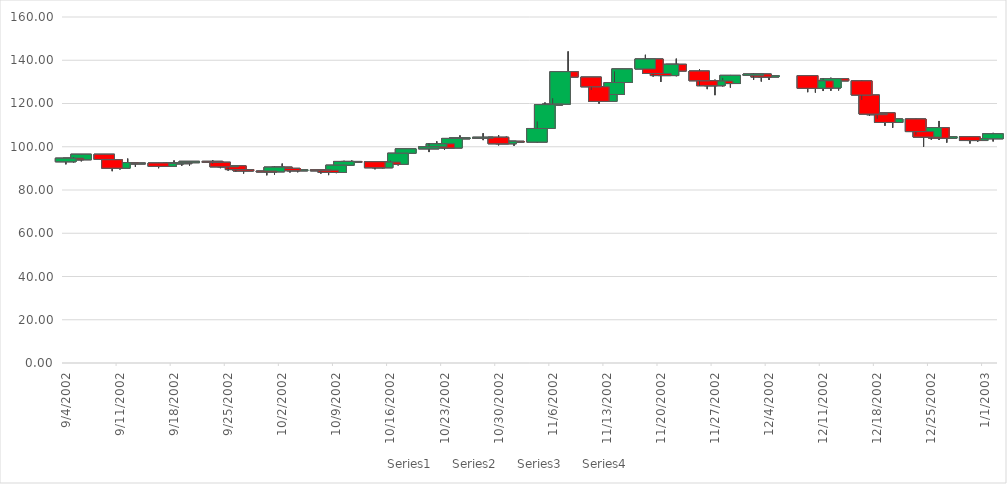
| Category | Series 0 | Series 1 | Series 2 | Series 3 |
|---|---|---|---|---|
| 1/2/03 | 103.7 | 106.42 | 102.47 | 105.99 |
| 12/31/02 | 102.88 | 103.97 | 102.29 | 103.7 |
| 12/30/02 | 104.64 | 104.79 | 101.5 | 102.88 |
| 12/27/02 | 103.97 | 104.94 | 101.92 | 104.64 |
| 12/26/02 | 108.84 | 111.92 | 103.13 | 103.97 |
| 12/25/02 | 104.47 | 109.06 | 103.27 | 108.84 |
| 12/24/02 | 107.02 | 107.31 | 100.02 | 104.47 |
| 12/23/02 | 112.86 | 112.95 | 105.53 | 107.02 |
| 12/20/02 | 111.25 | 113.51 | 108.79 | 112.86 |
| 12/19/02 | 115.69 | 115.69 | 109.71 | 111.25 |
| 12/18/02 | 115.11 | 117.25 | 112.93 | 115.28 |
| 12/17/02 | 123.92 | 123.92 | 114.31 | 115.11 |
| 12/16/02 | 130.47 | 130.86 | 121.64 | 123.92 |
| 12/13/02 | 131.47 | 131.47 | 126.05 | 130.47 |
| 12/12/02 | 127.17 | 131.92 | 125.89 | 131.47 |
| 12/11/02 | 130.48 | 131.57 | 125.77 | 127.17 |
| 12/10/02 | 127.04 | 130.48 | 125.07 | 130.48 |
| 12/9/02 | 132.87 | 132.87 | 125.24 | 127.04 |
| 12/4/02 | 132.26 | 132.87 | 130.86 | 132.87 |
| 12/3/02 | 133.64 | 133.64 | 130.19 | 132.26 |
| 12/2/02 | 133 | 134.08 | 130.97 | 133.64 |
| 11/29/02 | 129.24 | 133.19 | 127.38 | 133 |
| 11/28/02 | 130.37 | 131.86 | 127.93 | 129.24 |
| 11/27/02 | 128.24 | 131.02 | 123.86 | 130.37 |
| 11/26/02 | 130.53 | 131.89 | 126.65 | 128.24 |
| 11/25/02 | 135.01 | 135.8 | 128.12 | 130.53 |
| 11/22/02 | 138.11 | 140.72 | 132.62 | 135.01 |
| 11/21/02 | 132.92 | 138.22 | 132.92 | 138.11 |
| 11/20/02 | 133.88 | 135.01 | 130 | 132.92 |
| 11/19/02 | 140.58 | 140.58 | 132.47 | 133.88 |
| 11/18/02 | 135.98 | 142.51 | 135.98 | 140.58 |
| 11/15/02 | 129.71 | 135.98 | 127.35 | 135.98 |
| 11/14/02 | 124.17 | 134.88 | 124.17 | 129.71 |
| 11/13/02 | 120.98 | 124.66 | 120.78 | 124.17 |
| 11/12/02 | 127.74 | 127.74 | 119.9 | 120.98 |
| 11/11/02 | 132.22 | 132.22 | 126.24 | 127.74 |
| 11/8/02 | 134.72 | 144.08 | 126.94 | 132.22 |
| 11/7/02 | 119.73 | 134.76 | 119.66 | 134.72 |
| 11/6/02 | 119.47 | 122.47 | 118.24 | 119.73 |
| 11/5/02 | 108.44 | 120.46 | 108.44 | 119.47 |
| 11/4/02 | 102.17 | 111.72 | 101.89 | 108.44 |
| 11/1/02 | 102.52 | 102.52 | 100.44 | 102.17 |
| 10/31/02 | 101.39 | 104.66 | 101.39 | 102.52 |
| 10/30/02 | 104.38 | 105.41 | 100.66 | 101.39 |
| 10/28/02 | 104.12 | 106.25 | 103.06 | 104.38 |
| 10/25/02 | 103.84 | 105.23 | 102.38 | 104.12 |
| 10/24/02 | 99.44 | 103.84 | 99.39 | 103.84 |
| 10/23/02 | 101.37 | 101.65 | 98.51 | 99.44 |
| 10/22/02 | 99.97 | 102.49 | 99.39 | 101.37 |
| 10/21/02 | 99.04 | 101.62 | 97.55 | 99.97 |
| 10/18/02 | 96.99 | 99.04 | 94.85 | 99.04 |
| 10/17/02 | 91.9 | 96.99 | 91.37 | 96.99 |
| 10/16/02 | 92.91 | 93.6 | 91.28 | 91.9 |
| 10/15/02 | 90.3 | 92.91 | 90.07 | 92.91 |
| 10/14/02 | 93.07 | 93.07 | 89.59 | 90.3 |
| 10/11/02 | 93.2 | 93.63 | 91.68 | 93.07 |
| 10/10/02 | 91.46 | 93.49 | 89.4 | 93.2 |
| 10/9/02 | 88.09 | 91.46 | 87.8 | 91.46 |
| 10/8/02 | 89.13 | 89.39 | 86.89 | 88.09 |
| 10/7/02 | 89.33 | 89.33 | 87.59 | 89.13 |
| 10/4/02 | 88.94 | 89.75 | 88.21 | 89.33 |
| 10/3/02 | 90.01 | 90.01 | 88.09 | 88.94 |
| 10/2/02 | 90.57 | 92.21 | 89.04 | 90.01 |
| 10/1/02 | 88.42 | 90.82 | 87.14 | 90.57 |
| 9/30/02 | 88.78 | 88.78 | 86.81 | 88.42 |
| 9/27/02 | 89.45 | 89.57 | 87.63 | 88.78 |
| 9/26/02 | 91.19 | 91.44 | 88.52 | 89.45 |
| 9/25/02 | 90.72 | 91.19 | 88.96 | 91.19 |
| 9/24/02 | 92.82 | 92.82 | 90.1 | 90.72 |
| 9/23/02 | 93.25 | 93.87 | 92.12 | 92.82 |
| 9/20/02 | 92.64 | 93.25 | 91.32 | 93.25 |
| 9/19/02 | 92.58 | 92.73 | 91.24 | 92.64 |
| 9/18/02 | 92.25 | 93.65 | 91.64 | 92.58 |
| 9/17/02 | 90.93 | 92.69 | 90.93 | 92.25 |
| 9/16/02 | 92.49 | 92.52 | 90.09 | 90.93 |
| 9/13/02 | 92.34 | 92.6 | 90.7 | 92.49 |
| 9/12/02 | 92.68 | 94.51 | 91.54 | 92.34 |
| 9/11/02 | 90.08 | 92.68 | 89.48 | 92.68 |
| 9/10/02 | 93.99 | 93.99 | 88.71 | 90.08 |
| 9/9/02 | 96.53 | 96.56 | 93.88 | 94.12 |
| 9/6/02 | 94 | 96.53 | 93.28 | 96.53 |
| 9/5/02 | 94.7 | 95.25 | 92.77 | 94 |
| 9/4/02 | 93.07 | 94.7 | 91.88 | 94.7 |